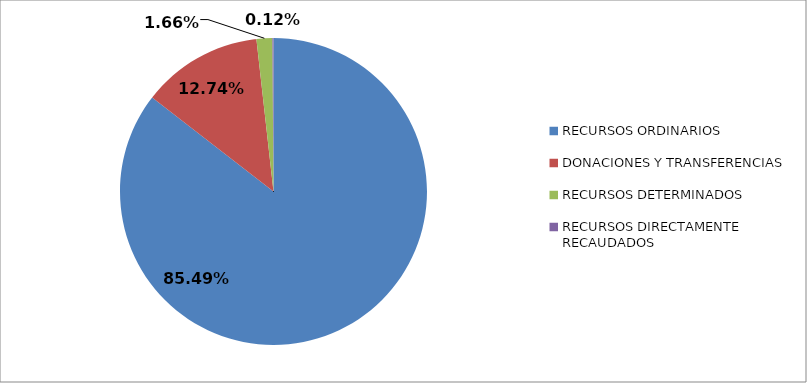
| Category | 445 REGION CAJAMARCA |
|---|---|
| RECURSOS ORDINARIOS | 0.855 |
| DONACIONES Y TRANSFERENCIAS | 0.127 |
| RECURSOS DETERMINADOS | 0.017 |
| RECURSOS DIRECTAMENTE RECAUDADOS | 0.001 |